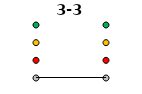
| Category | 0 | 1 | 2 | 3 | 3-3 |
|---|---|---|---|---|---|
| Time 1 | 0 | 1 | 2 | 3 | 0 |
| Time 2 | 0 | 1 | 2 | 3 | 0 |